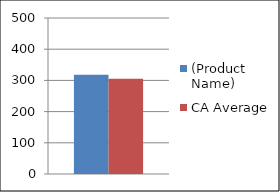
| Category | (Product Name) | CA Average |
|---|---|---|
| 0 | 318 | 305 |